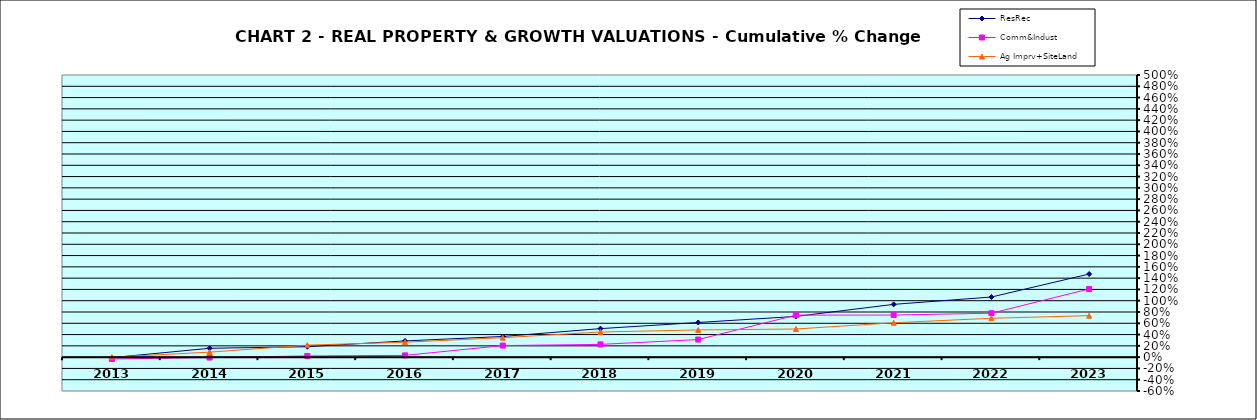
| Category | ResRec | Comm&Indust | Ag Imprv+SiteLand |
|---|---|---|---|
| 2013.0 | -0.009 | -0.033 | 0 |
| 2014.0 | 0.157 | -0.007 | 0.089 |
| 2015.0 | 0.185 | 0.021 | 0.213 |
| 2016.0 | 0.287 | 0.031 | 0.265 |
| 2017.0 | 0.366 | 0.205 | 0.345 |
| 2018.0 | 0.506 | 0.226 | 0.445 |
| 2019.0 | 0.614 | 0.312 | 0.482 |
| 2020.0 | 0.722 | 0.744 | 0.499 |
| 2021.0 | 0.936 | 0.746 | 0.609 |
| 2022.0 | 1.065 | 0.779 | 0.689 |
| 2023.0 | 1.473 | 1.208 | 0.735 |